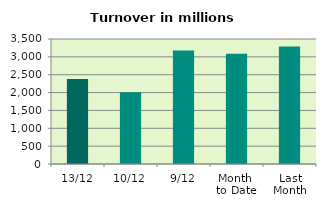
| Category | Series 0 |
|---|---|
| 13/12 | 2376.543 |
| 10/12 | 2007.797 |
| 9/12 | 3179.935 |
| Month 
to Date | 3087.165 |
| Last
Month | 3292.145 |